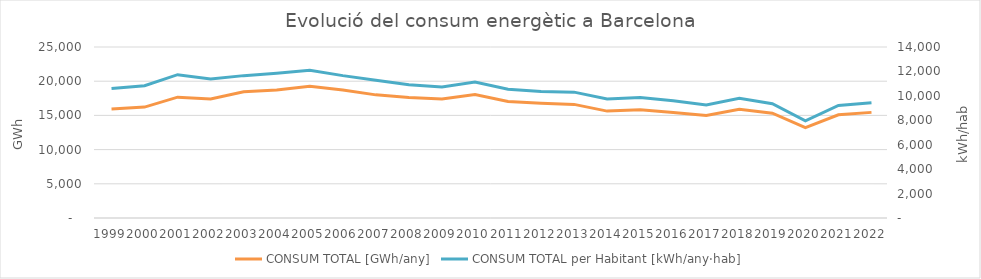
| Category | CONSUM TOTAL [GWh/any] |
|---|---|
| 1999.0 | 15943.141 |
| 2000.0 | 16211.385 |
| 2001.0 | 17663.115 |
| 2002.0 | 17390.867 |
| 2003.0 | 18448.502 |
| 2004.0 | 18719.019 |
| 2005.0 | 19263.301 |
| 2006.0 | 18715.221 |
| 2007.0 | 18002.945 |
| 2008.0 | 17629.626 |
| 2009.0 | 17407.919 |
| 2010.0 | 18036.877 |
| 2011.0 | 17018.627 |
| 2012.0 | 16782.012 |
| 2013.0 | 16609.183 |
| 2014.0 | 15627.565 |
| 2015.0 | 15841.858 |
| 2016.0 | 15433.736 |
| 2017.0 | 14995.307 |
| 2018.0 | 15896.222 |
| 2019.0 | 15320.454 |
| 2020.0 | 13222 |
| 2021.0 | 15084.088 |
| 2022.0 | 15442.559 |